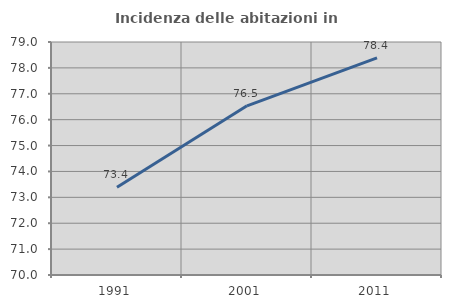
| Category | Incidenza delle abitazioni in proprietà  |
|---|---|
| 1991.0 | 73.393 |
| 2001.0 | 76.535 |
| 2011.0 | 78.385 |